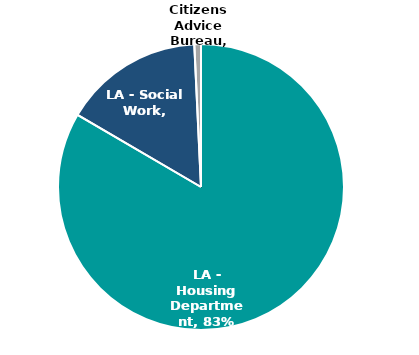
| Category | Series 0 |
|---|---|
| LA - Housing Department | 0.826 |
| LA - Social Work | 0.157 |
| Citizens Advice Bureau | 0.007 |